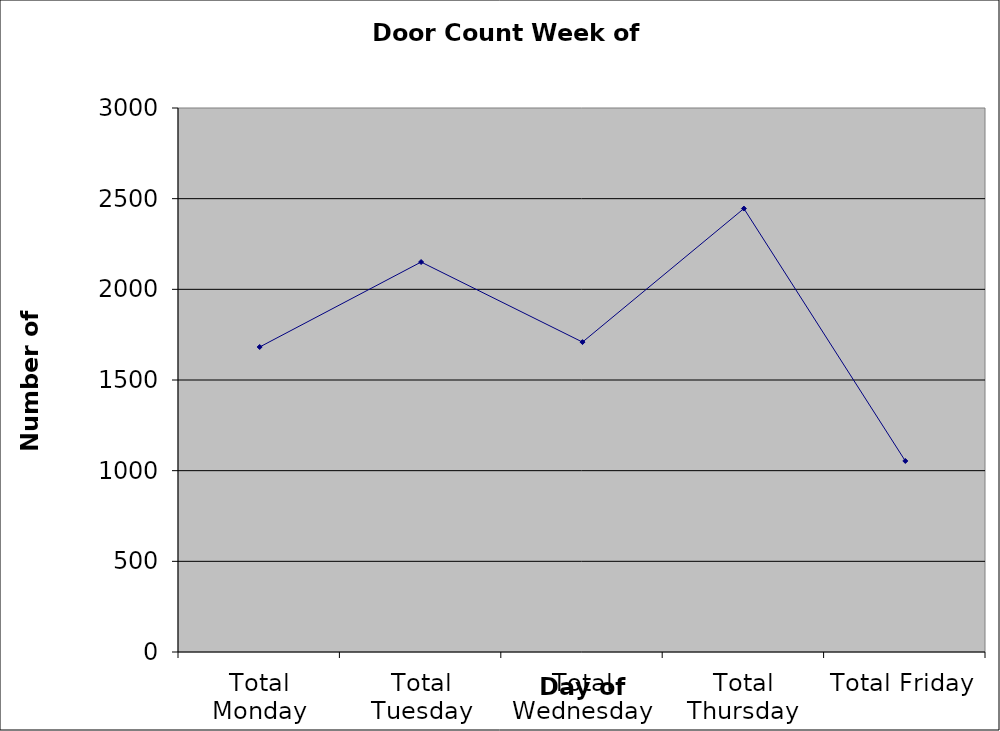
| Category | Series 0 |
|---|---|
| Total Monday | 1682 |
| Total Tuesday | 2150.5 |
| Total Wednesday | 1709 |
| Total Thursday | 2445.5 |
| Total Friday | 1053.5 |